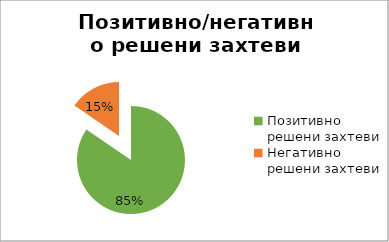
| Category | Series 0 |
|---|---|
| Позитивно решени захтеви | 30095 |
| Негативно решени захтеви | 5513 |